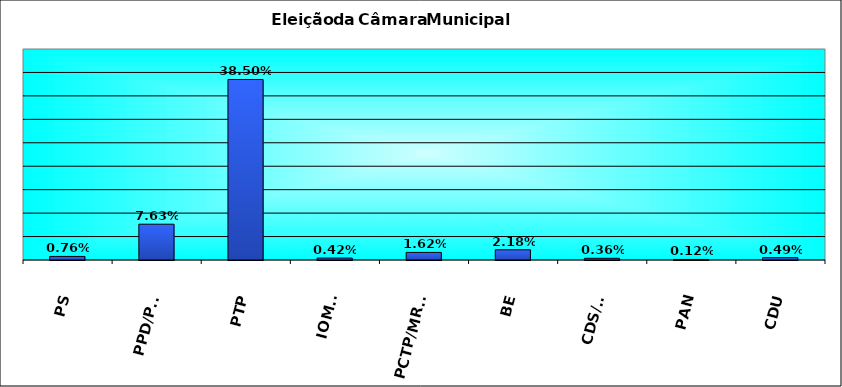
| Category | Series 0 |
|---|---|
| PS | 0.008 |
| PPD/PSD | 0.076 |
| PTP | 0.385 |
| IOMAF | 0.004 |
| PCTP/MRPP | 0.016 |
| BE | 0.022 |
| CDS/PP | 0.004 |
| PAN | 0.001 |
| CDU | 0.005 |